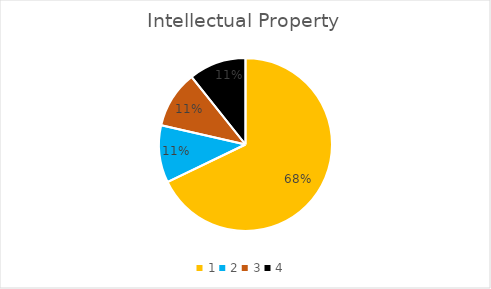
| Category | Series 0 |
|---|---|
| 0 | 0.679 |
| 1 | 0.107 |
| 2 | 0.107 |
| 3 | 0.107 |